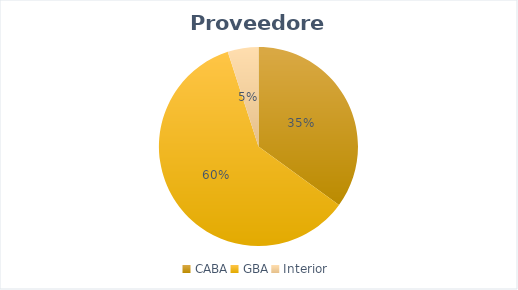
| Category | Series 0 |
|---|---|
| CABA | 7 |
| GBA | 12 |
| Interior | 1 |